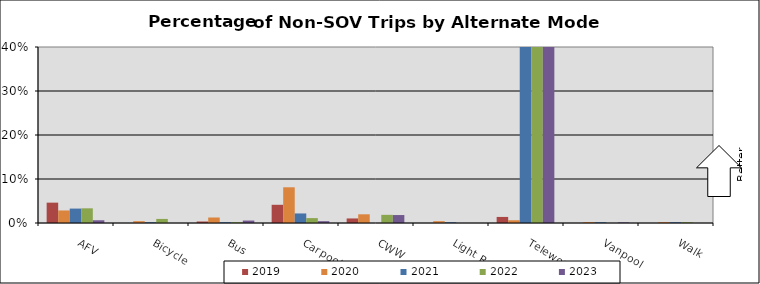
| Category | 2019 | 2020 | 2021 | 2022 | 2023 |
|---|---|---|---|---|---|
| AFV | 0.046 | 0.029 | 0.033 | 0.033 | 0.006 |
| Bicycle | 0 | 0.004 | 0.002 | 0.009 | 0 |
| Bus | 0.003 | 0.012 | 0.002 | 0.002 | 0.006 |
| Carpool | 0.041 | 0.081 | 0.022 | 0.011 | 0.004 |
| CWW | 0.01 | 0.02 | 0 | 0.019 | 0.018 |
| Light Rail | 0 | 0.004 | 0.002 | 0 | 0 |
| Telework | 0.014 | 0.006 | 0.463 | 0.523 | 0.618 |
| Vanpool | 0 | 0.002 | 0.002 | 0 | 0.001 |
| Walk | 0 | 0.002 | 0.002 | 0.002 | 0 |